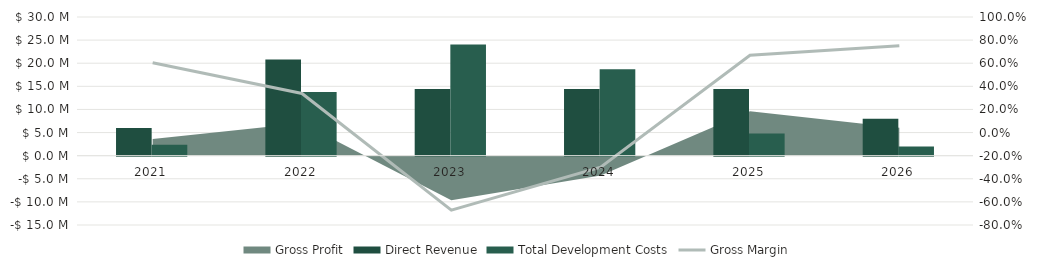
| Category | Direct Revenue | Total Development Costs |
|---|---|---|
| 0 | 6000000 | 2380280.848 |
| 1 | 20800000 | 13773749.348 |
| 2 | 14400000 | 24061271.84 |
| 3 | 14400000 | 18710634.697 |
| 4 | 14400000 | 4776776.635 |
| 5 | 8000000 | 1984581.112 |